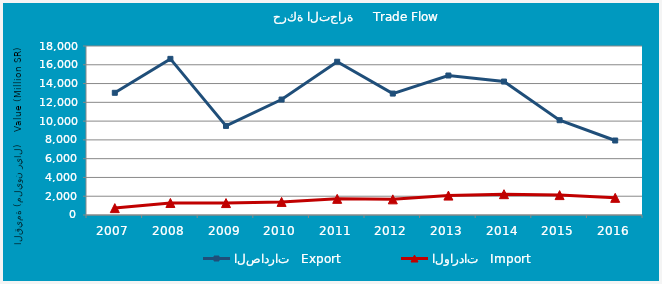
| Category | الصادرات   Export | الواردات   Import |
|---|---|---|
| 2007.0 | 13015.318 | 733.759 |
| 2008.0 | 16629.502 | 1282.981 |
| 2009.0 | 9487.487 | 1271.381 |
| 2010.0 | 12298.438 | 1394.308 |
| 2011.0 | 16322.874 | 1719.175 |
| 2012.0 | 12932.543 | 1666.15 |
| 2013.0 | 14856.421 | 2067.72 |
| 2014.0 | 14212.495 | 2217.223 |
| 2015.0 | 10096.6 | 2118.834 |
| 2016.0 | 7933.962 | 1828.387 |